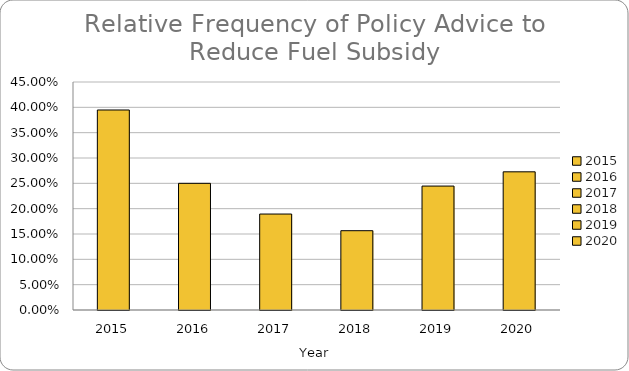
| Category | Reduce Fuel Subsidy |
|---|---|
| 2015.0 | 0.395 |
| 2016.0 | 0.25 |
| 2017.0 | 0.189 |
| 2018.0 | 0.157 |
| 2019.0 | 0.245 |
| 2020.0 | 0.273 |